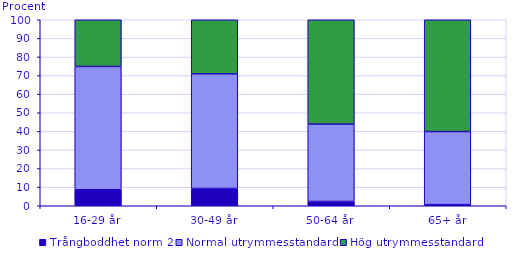
| Category | Trångboddhet norm 2 | Normal utrymmesstandard | Hög utrymmesstandard |
|---|---|---|---|
| 16-29 år | 8.6 | 66.3 | 25.1 |
| 30-49 år | 9.3 | 61.6 | 29.1 |
| 50-64 år | 2.3 | 41.6 | 56.1 |
| 65+ år | 0.6 | 39.3 | 60.1 |